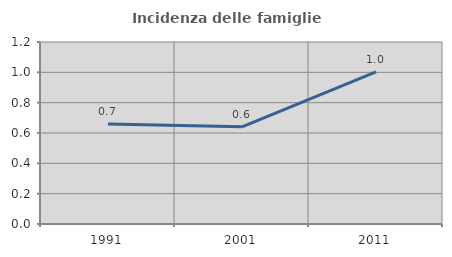
| Category | Incidenza delle famiglie numerose |
|---|---|
| 1991.0 | 0.66 |
| 2001.0 | 0.641 |
| 2011.0 | 1.003 |